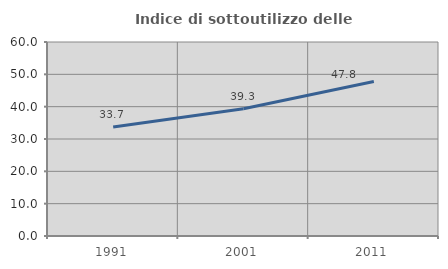
| Category | Indice di sottoutilizzo delle abitazioni  |
|---|---|
| 1991.0 | 33.678 |
| 2001.0 | 39.328 |
| 2011.0 | 47.77 |